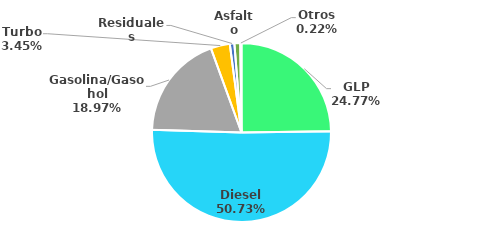
| Category | MBPD |
|---|---|
| GLP | 54.482 |
| Diesel | 111.598 |
| Gasolina/Gasohol | 41.722 |
| Turbo | 7.596 |
| Residuales | 1.802 |
| Asfalto | 2.315 |
| Otros | 0.487 |